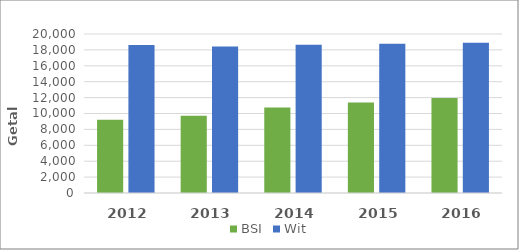
| Category | BSI | Wit |
|---|---|---|
| 2012.0 | 9221 | 18602 |
| 2013.0 | 9732 | 18424 |
| 2014.0 | 10757 | 18636 |
| 2015.0 | 11386 | 18764 |
| 2016.0 | 11947 | 18907 |